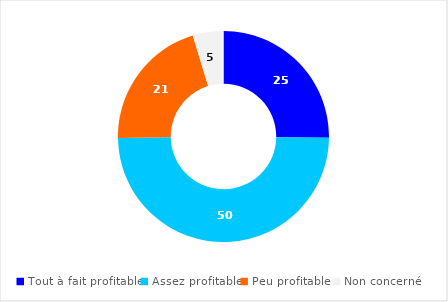
| Category | Series 0 |
|---|---|
| Tout à fait profitable | 25.19 |
| Assez profitable | 49.6 |
| Peu profitable  | 20.5 |
| Non concerné | 4.71 |